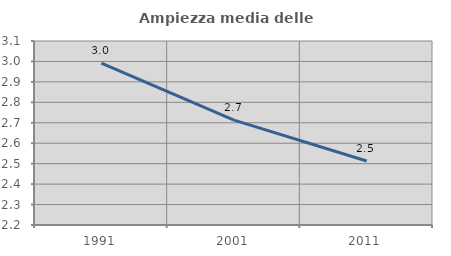
| Category | Ampiezza media delle famiglie |
|---|---|
| 1991.0 | 2.991 |
| 2001.0 | 2.713 |
| 2011.0 | 2.513 |